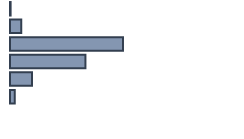
| Category | Series 0 |
|---|---|
| 0 | 0.269 |
| 1 | 4.939 |
| 2 | 49.774 |
| 3 | 33.23 |
| 4 | 9.694 |
| 5 | 2.094 |
| 6 | 0 |